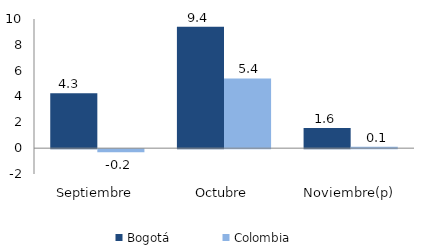
| Category | Bogotá | Colombia |
|---|---|---|
| Septiembre | 4.258 | -0.237 |
| Octubre | 9.398 | 5.401 |
| Noviembre(p) | 1.555 | 0.115 |